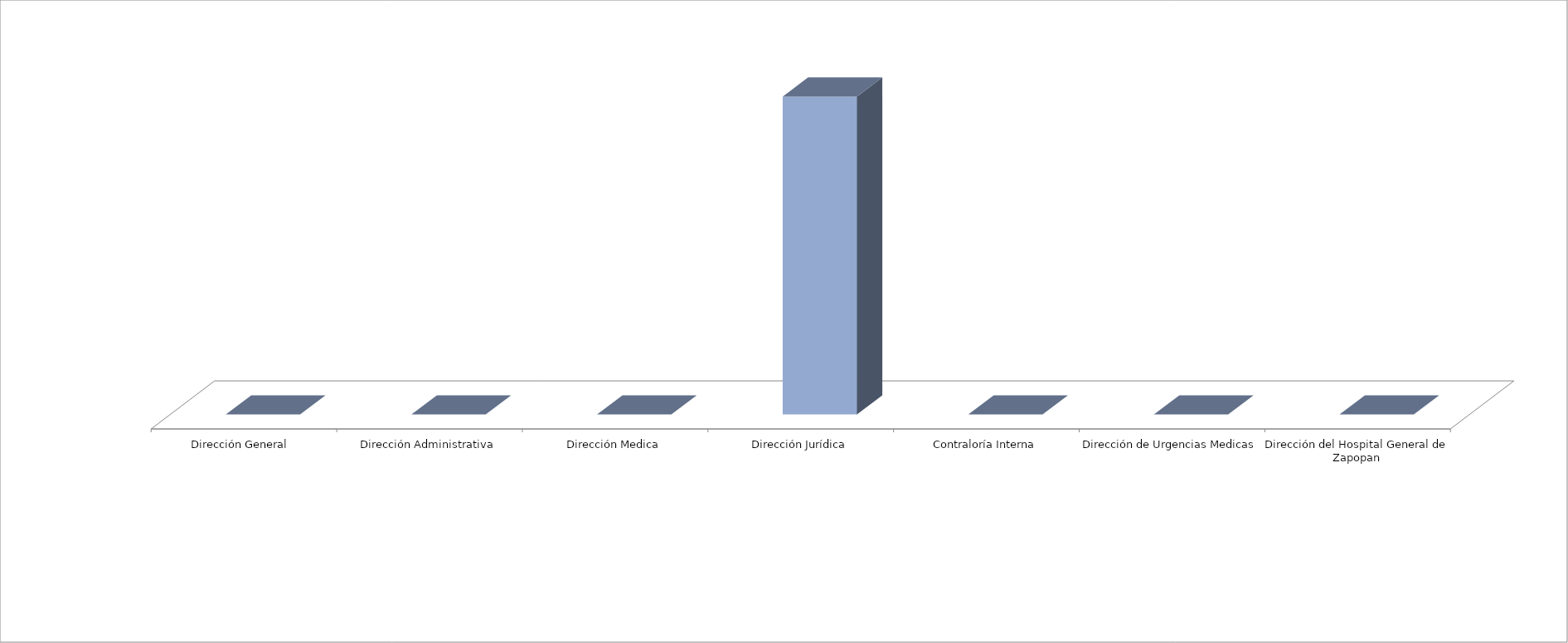
| Category | Series 0 | Series 1 |
|---|---|---|
| Dirección General  |  | 0 |
| Dirección Administrativa |  | 0 |
| Dirección Medica |  | 0 |
| Dirección Jurídica |  | 21 |
| Contraloría Interna |  | 0 |
| Dirección de Urgencias Medicas |  | 0 |
| Dirección del Hospital General de Zapopan |  | 0 |